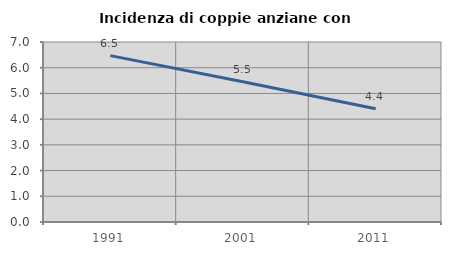
| Category | Incidenza di coppie anziane con figli |
|---|---|
| 1991.0 | 6.471 |
| 2001.0 | 5.455 |
| 2011.0 | 4.403 |